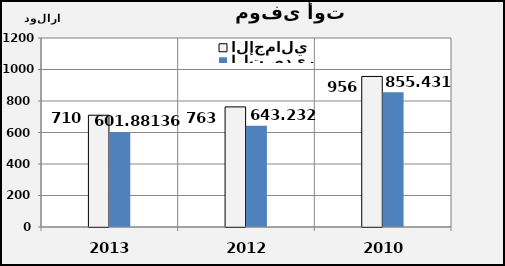
| Category | الإجمالي | التصدير |
|---|---|---|
| 2013.0 | 709.802 | 601.881 |
| 2012.0 | 762.552 | 643.232 |
| 2010.0 | 955.893 | 855.431 |